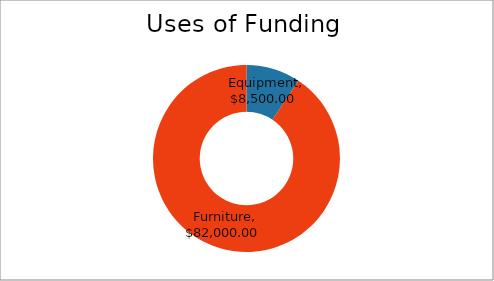
| Category | Uses of Funding |
|---|---|
| Equipment | 8500 |
| Furniture | 82000 |
| Required Starting Cash Balance | 0 |
| Starting Inventory | 0 |
| Other One Time Startup Costs | 0 |